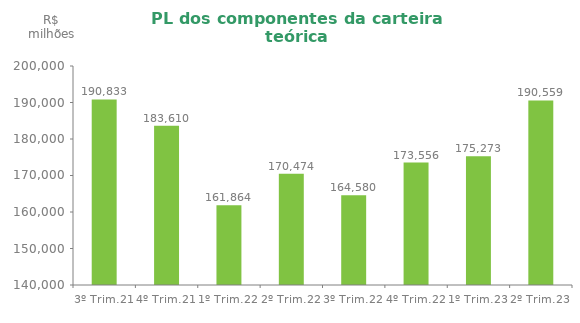
| Category | Series 0 |
|---|---|
| 3º Trim.21 | 190833.2 |
| 4º Trim.21 | 183610.486 |
| 1º Trim.22 | 161864.31 |
| 2º Trim.22 | 170474.192 |
| 3º Trim.22 | 164580 |
| 4º Trim.22 | 173556 |
| 1º Trim.23 | 175273 |
| 2º Trim.23 | 190559 |